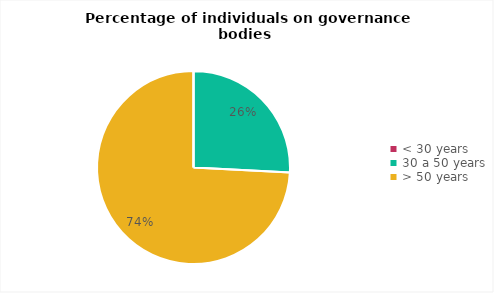
| Category | Series 0 |
|---|---|
| < 30 years | 0 |
| 30 a 50 years | 8 |
| > 50 years | 23 |